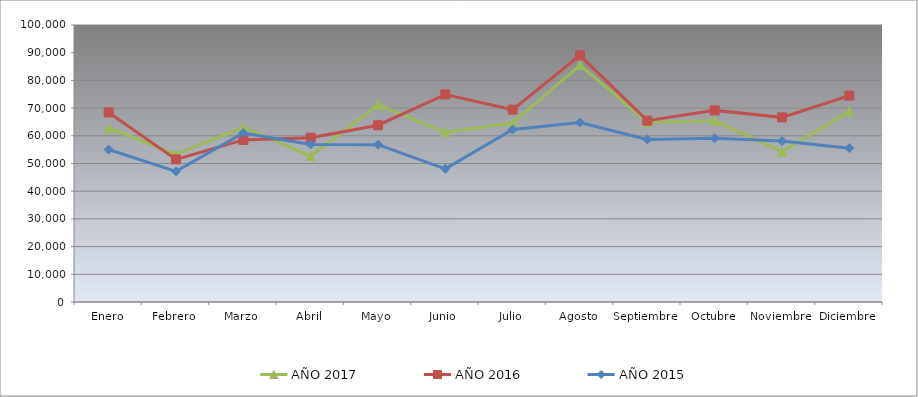
| Category | AÑO 2017 | AÑO 2016 | AÑO 2015 |
|---|---|---|---|
| Enero | 62807.988 | 68447.46 | 55036.623 |
| Febrero | 53372.22 | 51484.935 | 47144.287 |
| Marzo | 63080.769 | 58516.356 | 60991.749 |
| Abril | 52739.863 | 59294.168 | 56891.045 |
| Mayo | 71189.825 | 63817.923 | 56797.221 |
| Junio | 61264.291 | 74925.079 | 48071.498 |
| Julio | 64587.268 | 69455.505 | 62299.779 |
| Agosto | 85517.064 | 89056.368 | 64799.938 |
| Septiembre | 64835.252 | 65466.885 | 58695.796 |
| Octubre | 65418.012 | 69175.492 | 59098.692 |
| Noviembre | 54277.36 | 66655.381 | 58110.77 |
| Diciembre | 68790.586 | 74501.949 | 55544.381 |